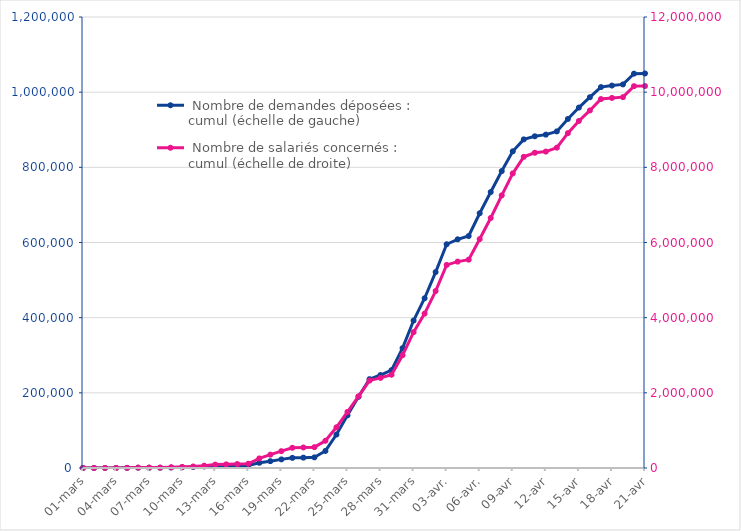
| Category |  Nombre de demandes déposées : cumul (échelle de gauche) |
|---|---|
| 01-mars | 25 |
| 02-mars | 49 |
| 03-mars | 121 |
| 04-mars | 235 |
| 05-mars | 429 |
| 06-mars | 778 |
| 07-mars | 791 |
| 08-mars | 802 |
| 09-mars | 1278 |
| 10-mars | 1941 |
| 11-mars | 2866 |
| 12-mars | 4134 |
| 13-mars | 5649 |
| 14-mars | 6060 |
| 15-mars | 6631 |
| 16-mars | 6923 |
| 17-mars | 13818 |
| 18-mars | 18191 |
| 19-mars | 22954 |
| 20-mars | 26978 |
| 21-mars | 27566 |
| 22-mars | 28310 |
| 23-mars | 45383 |
| 24-mars | 88959 |
| 25-mars | 140163 |
| 26-mars | 189334 |
| 27-mars | 236414 |
| 28-mars | 247394 |
| 29-mars | 260305 |
| 30-mars | 318941 |
| 31-mars | 392362 |
| 01-avr. | 451677 |
| 02-avr. | 521330 |
| 03-avr. | 595346 |
| 04-avr. | 608514 |
| 05-avr. | 617347 |
| 06-avr. | 677891 |
| 07-avr. | 734260 |
| 08-avr | 790041 |
| 09-avr | 842684 |
| 10-avr | 874434 |
| 11-avr | 882637 |
| 12-avr | 887008 |
| 13-avr | 895619 |
| 14-avr | 928639 |
| 15-avr | 959021 |
| 16-avr | 986676 |
| 17-avr | 1013537 |
| 18-avr | 1017624 |
| 19-avr | 1020573 |
| 20-avr | 1049231 |
| 21-avr | 1049719 |